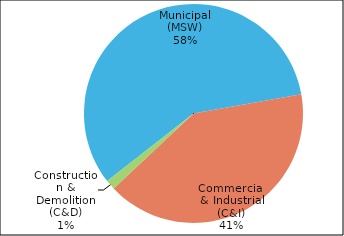
| Category | Series 0 |
|---|---|
| Municipal (MSW) | 79206.64 |
| Commercial & Industrial (C&I) | 55979.63 |
| Construction & Demolition (C&D) | 1981.15 |